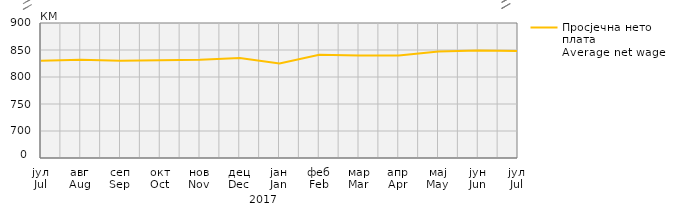
| Category | Просјечна нето плата
Average net wage |
|---|---|
| јул
Jul | 830 |
| авг
Aug | 832 |
| сеп
Sep | 830 |
| окт
Oct | 831 |
| нов
Nov | 832 |
| дец
Dec | 835 |
| јан
Jan | 825 |
| феб
Feb | 841 |
| мар
Mar | 840 |
| апр
Apr | 840 |
| мај
May | 847 |
| јун
Jun | 849 |
| јул
Jul | 848 |